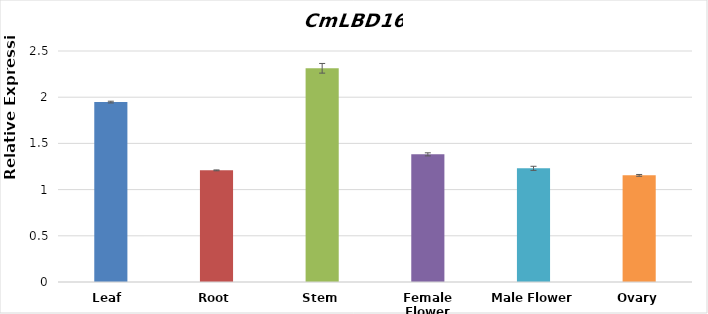
| Category | CmLBD16 |
|---|---|
| Leaf  | 1.947 |
| Root | 1.208 |
| Stem | 2.313 |
| Female Flower | 1.381 |
| Male Flower | 1.23 |
| Ovary | 1.154 |